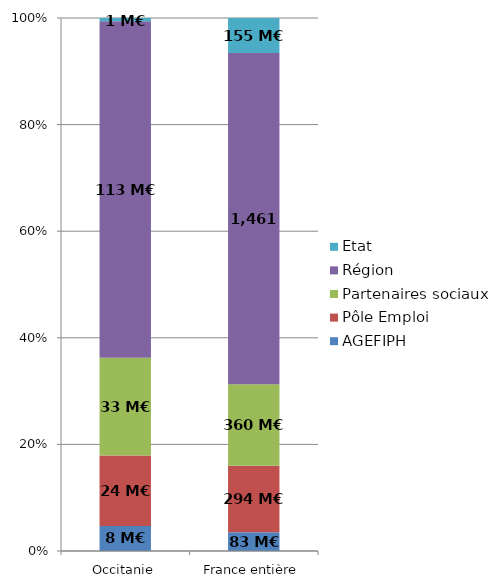
| Category | AGEFIPH | Pôle Emploi | Partenaires sociaux | Région | Etat |
|---|---|---|---|---|---|
| Occitanie | 8.435 | 23.702 | 32.816 | 113.074 | 1.13 |
| France entière | 82.716 | 293.959 | 359.593 | 1461.057 | 154.74 |